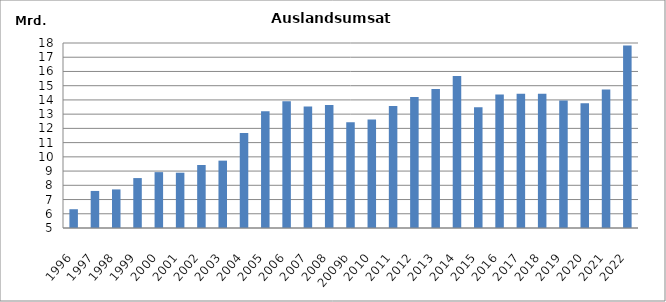
| Category | Series 0 |
|---|---|
| 1996 | 6319142 |
| 1997 | 7603819 |
| 1998 | 7711587 |
| 1999 | 8508603 |
| 2000 | 8925754 |
| 2001 | 8885463 |
| 2002 | 9428713 |
| 2003 | 9733339 |
| 2004 | 11680546 |
| 2005 | 13208153 |
| 2006 | 13901521 |
| 2007 | 13537187 |
| 2008 | 13649884 |
| 2009b | 12432618 |
| 2010 | 12628416.402 |
| 2011 | 13577795 |
| 2012 | 14199097 |
| 2013 | 14765099 |
| 2014 | 15677925.464 |
| 2015 | 13486756 |
| 2016 | 14385658 |
| 2017 | 14436506 |
| 2018 | 14434940 |
| 2019 | 13955245 |
| 2020 | 13761427 |
| 2021 | 14734266.581 |
| 2022 | 17818242.472 |